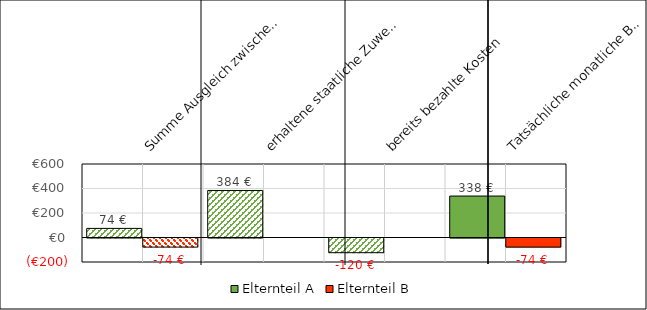
| Category | Elternteil A | Elternteil B |
|---|---|---|
| Summe Ausgleich zwischen den Haushalten | 74.339 | -74.339 |
| erhaltene staatliche Zuwendungen | 384 | 0 |
| bereits bezahlte Kosten | -120 | 0 |
| Tatsächliche monatliche Belastung/Entlastung (kumuliert) | 338.339 | -74.339 |